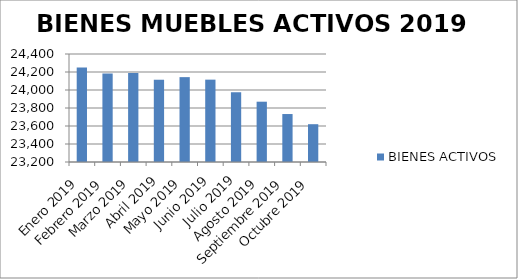
| Category | BIENES ACTIVOS |
|---|---|
| Enero 2019 | 24249 |
| Febrero 2019 | 24183 |
| Marzo 2019 | 24188 |
| Abril 2019 | 24114 |
| Mayo 2019 | 24143 |
| Junio 2019 | 24115 |
| Julio 2019 | 23975 |
| Agosto 2019 | 23870 |
| Septiembre 2019 | 23733 |
| Octubre 2019 | 23620 |